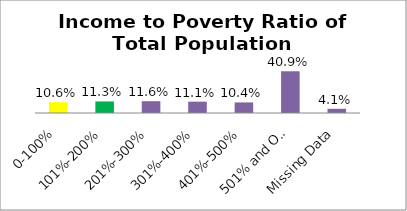
| Category | Percent |
|---|---|
| 0-100% | 0.106 |
| 101%-200% | 0.113 |
| 201%-300% | 0.116 |
| 301%-400% | 0.111 |
| 401%-500% | 0.104 |
| 501% and Over | 0.409 |
| Missing Data | 0.041 |